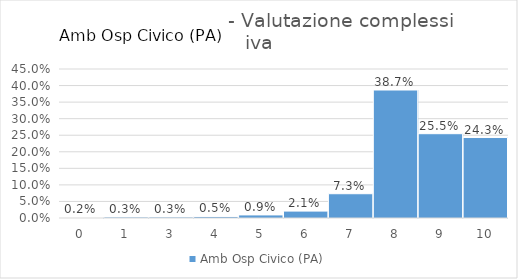
| Category | Amb Osp Civico (PA) |
|---|---|
| 0.0 | 0.002 |
| 1.0 | 0.003 |
| 3.0 | 0.003 |
| 4.0 | 0.005 |
| 5.0 | 0.009 |
| 6.0 | 0.021 |
| 7.0 | 0.073 |
| 8.0 | 0.387 |
| 9.0 | 0.255 |
| 10.0 | 0.243 |